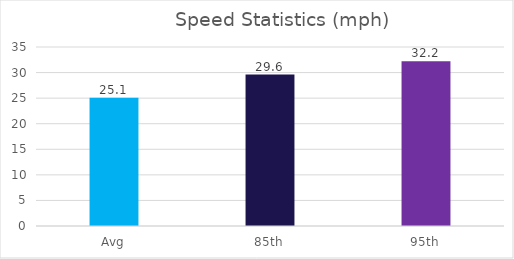
| Category | Series 0 |
|---|---|
| Avg | 25.1 |
| 85th | 29.6 |
| 95th | 32.2 |